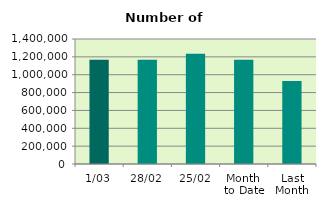
| Category | Series 0 |
|---|---|
| 1/03 | 1167424 |
| 28/02 | 1167322 |
| 25/02 | 1235824 |
| Month 
to Date | 1167424 |
| Last
Month | 928647.7 |